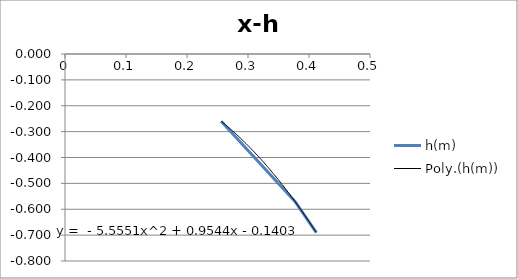
| Category | h(m) |
|---|---|
| 0.256 | -0.26 |
| 0.377 | -0.57 |
| 0.412 | -0.69 |